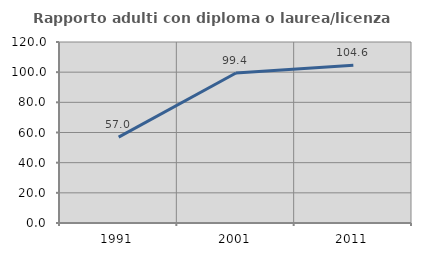
| Category | Rapporto adulti con diploma o laurea/licenza media  |
|---|---|
| 1991.0 | 56.977 |
| 2001.0 | 99.429 |
| 2011.0 | 104.641 |